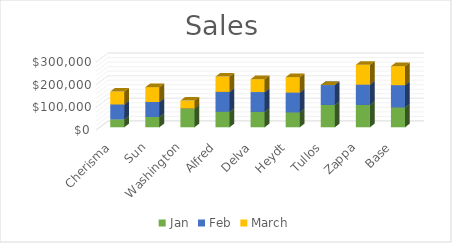
| Category | Jan | Feb | March |
|---|---|---|---|
| Cherisma | 35000 | 65987 | 56787 |
| Sun | 45676 | 65987 | 65478 |
| Washington | 82987 | 0 | 34765 |
| Alfred | 68560 | 87657 | 67865 |
| Delva | 67980 | 87657 | 56766 |
| Heydt | 65785 | 87657 | 67865 |
| Tullos | 98765 | 87657 | 0 |
| Zappa | 98765 | 89654 | 87678 |
| Base | 87546 | 98555 | 83655 |